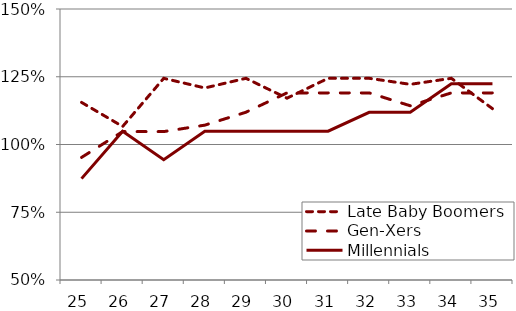
| Category | Late Baby Boomers | Gen-Xers | Millennials |
|---|---|---|---|
| 25.0 | 1.155 | 0.952 | 0.874 |
| 26.0 | 1.066 | 1.048 | 1.049 |
| 27.0 | 1.244 | 1.048 | 0.944 |
| 28.0 | 1.209 | 1.071 | 1.049 |
| 29.0 | 1.244 | 1.119 | 1.049 |
| 30.0 | 1.171 | 1.19 | 1.049 |
| 31.0 | 1.244 | 1.19 | 1.049 |
| 32.0 | 1.244 | 1.19 | 1.119 |
| 33.0 | 1.222 | 1.143 | 1.119 |
| 34.0 | 1.244 | 1.19 | 1.224 |
| 35.0 | 1.132 | 1.19 | 1.224 |